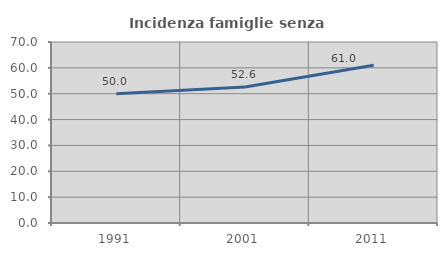
| Category | Incidenza famiglie senza nuclei |
|---|---|
| 1991.0 | 50 |
| 2001.0 | 52.582 |
| 2011.0 | 60.996 |